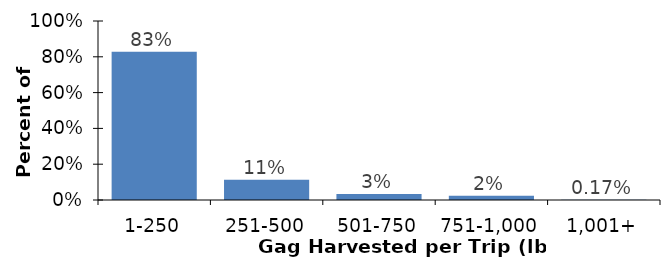
| Category | Series 0 |
|---|---|
| 1-250 | 0.828 |
| 251-500 | 0.113 |
| 501-750 | 0.033 |
| 751-1,000 | 0.024 |
| 1,001+ | 0.002 |